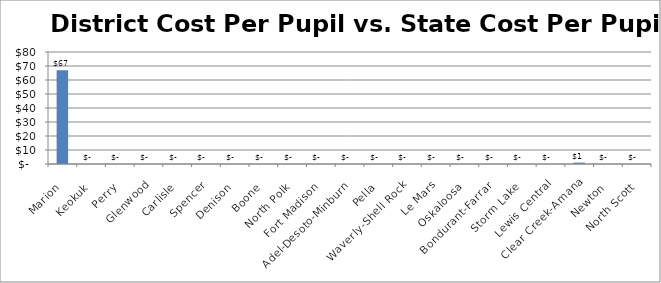
| Category | DCPP Vs. SCPP |
|---|---|
| Marion | 67 |
| Keokuk | 0 |
| Perry | 0 |
| Glenwood | 0 |
| Carlisle | 0 |
| Spencer | 0 |
| Denison | 0 |
| Boone | 0 |
| North Polk | 0 |
| Fort Madison | 0 |
| Adel-Desoto-Minburn | 0 |
| Pella | 0 |
| Waverly-Shell Rock | 0 |
| Le Mars | 0 |
| Oskaloosa | 0 |
| Bondurant-Farrar | 0 |
| Storm Lake | 0 |
| Lewis Central | 0 |
| Clear Creek-Amana | 1 |
| Newton | 0 |
| North Scott | 0 |